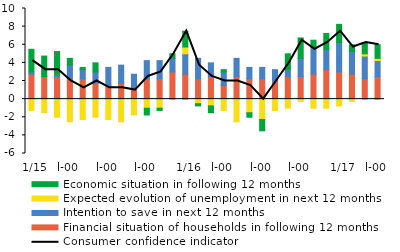
| Category | Financial situation of households in following 12 months | Intention to save in next 12 months | Expected evolution of unemployment in next 12 months | Economic situation in following 12 months |
|---|---|---|---|---|
| 0 | 2.75 | 0.25 | -1.25 | 2.5 |
| 1900-01-01 | 2.5 | 0 | -1.5 | 2.25 |
| 1900-01-02 | 2.5 | 0.25 | -2 | 2.5 |
| 1900-01-03 | 2.25 | 1.5 | -2.5 | 0.75 |
| 1900-01-04 | 2.25 | 1 | -2.25 | 0.25 |
| 1900-01-05 | 1.75 | 1.25 | -2 | 1 |
| 1900-01-06 | 1.5 | 2 | -2.25 | 0 |
| 1900-01-07 | 1.75 | 2 | -2.5 | 0 |
| 1900-01-08 | 1.25 | 1.5 | -1.75 | 0 |
| 1900-01-09 | 2.25 | 2 | -1 | -0.75 |
| 1900-01-10 | 2.25 | 2 | -1 | -0.25 |
| 1900-01-11 | 3 | 1.5 | 0 | 0.5 |
| 1900-01-12 | 2.75 | 2.25 | 0.75 | 1.75 |
| 1900-01-13 | 2.25 | 2.25 | -0.5 | -0.25 |
| 1900-01-14 | 2.5 | 1.5 | -0.75 | -0.75 |
| 1900-01-15 | 1.5 | 1.5 | -1.25 | 0.25 |
| 1900-01-16 | 2.5 | 2 | -2.5 | 0 |
| 1900-01-17 | 2.25 | 1.25 | -1.5 | -0.5 |
| 1900-01-18 | 2.25 | 1.25 | -2.25 | -1.25 |
| 1900-01-19 | 2 | 1.25 | -1.25 | 0 |
| 1900-01-20 | 2.5 | 0.75 | -1 | 1.75 |
| 1900-01-21 | 2.5 | 2 | -0.25 | 2.25 |
| 1900-01-22 | 2.75 | 3 | -1 | 0.75 |
| 1900-01-23 | 3.25 | 2.25 | -1 | 1.75 |
| 1900-01-24 | 3 | 3.25 | -0.75 | 2 |
| 1900-01-25 | 2.75 | 2.5 | -0.25 | 0.75 |
| 1900-01-26 | 2.25 | 2.5 | 0.25 | 1.25 |
| 1900-01-27 | 2.5 | 1.75 | 0.25 | 1.5 |